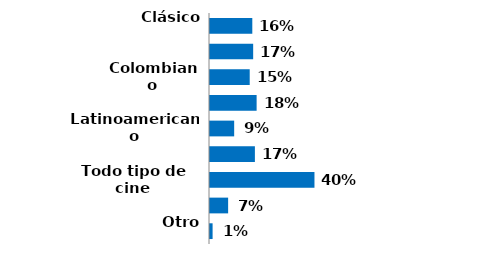
| Category | Series 0 |
|---|---|
| Clásico | 0.163 |
| Europeo | 0.167 |
| Colombiano | 0.153 |
| Estadounidense | 0.18 |
| Latinoamericano | 0.093 |
| Arte (independiente, experimental, autor) | 0.173 |
| Todo tipo de cine | 0.403 |
| Aventura | 0.07 |
| Otro | 0.01 |